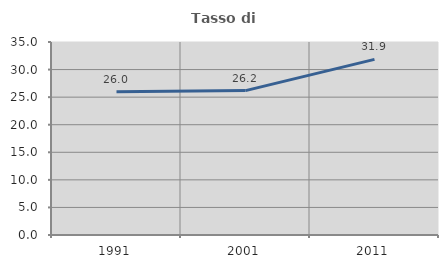
| Category | Tasso di occupazione   |
|---|---|
| 1991.0 | 25.993 |
| 2001.0 | 26.182 |
| 2011.0 | 31.854 |